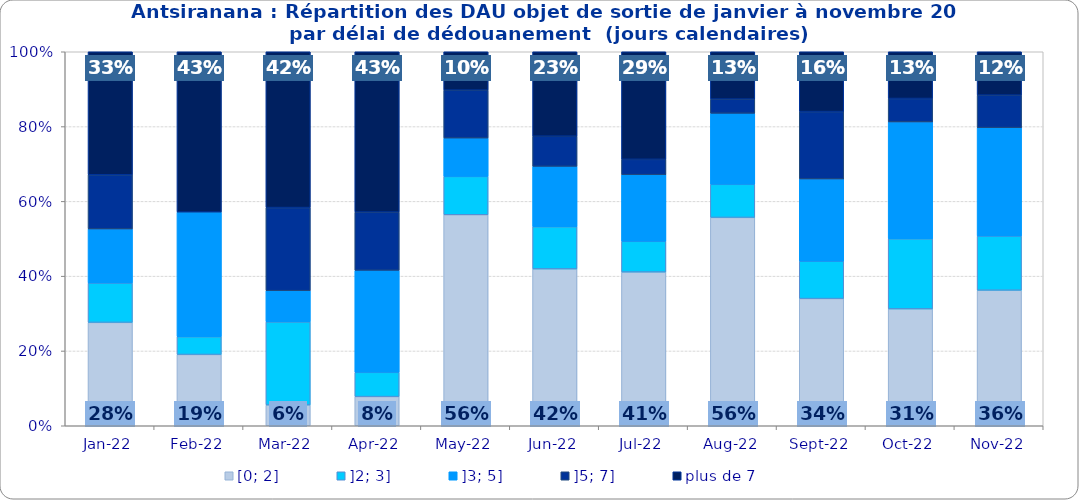
| Category | [0; 2] | ]2; 3] | ]3; 5] | ]5; 7] | plus de 7 |
|---|---|---|---|---|---|
| 2022-01-01 | 0.276 | 0.105 | 0.145 | 0.145 | 0.329 |
| 2022-02-01 | 0.19 | 0.048 | 0.333 | 0 | 0.429 |
| 2022-03-01 | 0.056 | 0.222 | 0.083 | 0.222 | 0.417 |
| 2022-04-01 | 0.078 | 0.065 | 0.273 | 0.156 | 0.429 |
| 2022-05-01 | 0.564 | 0.103 | 0.103 | 0.128 | 0.103 |
| 2022-06-01 | 0.419 | 0.113 | 0.161 | 0.081 | 0.226 |
| 2022-07-01 | 0.411 | 0.082 | 0.178 | 0.041 | 0.288 |
| 2022-08-01 | 0.557 | 0.089 | 0.19 | 0.038 | 0.127 |
| 2022-09-01 | 0.34 | 0.1 | 0.22 | 0.18 | 0.16 |
| 2022-10-01 | 0.312 | 0.188 | 0.312 | 0.062 | 0.125 |
| 2022-11-01 | 0.362 | 0.145 | 0.29 | 0.087 | 0.116 |